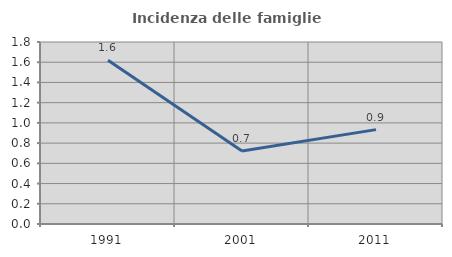
| Category | Incidenza delle famiglie numerose |
|---|---|
| 1991.0 | 1.62 |
| 2001.0 | 0.721 |
| 2011.0 | 0.933 |